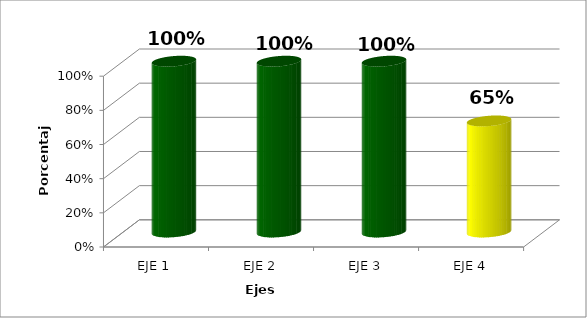
| Category | Series 0 |
|---|---|
| EJE 1 | 1 |
| EJE 2 | 1 |
| EJE 3 | 1 |
| EJE 4 | 0.65 |